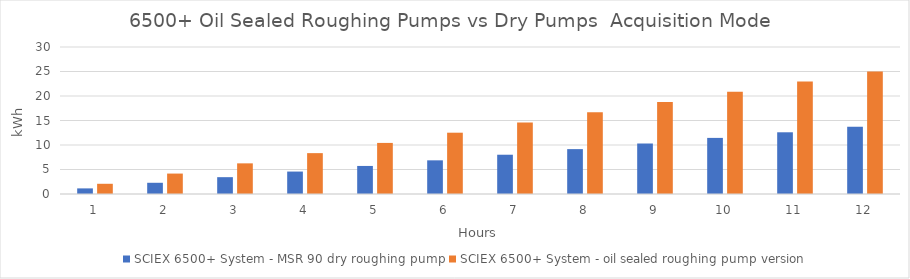
| Category | SCIEX 6500+ System - MSR 90 dry roughing pump | SCIEX 6500+ System - oil sealed roughing pump version  |
|---|---|---|
| 0 | 1.145 | 2.085 |
| 1 | 2.29 | 4.17 |
| 2 | 3.435 | 6.255 |
| 3 | 4.58 | 8.34 |
| 4 | 5.725 | 10.425 |
| 5 | 6.87 | 12.51 |
| 6 | 8.015 | 14.595 |
| 7 | 9.16 | 16.68 |
| 8 | 10.305 | 18.765 |
| 9 | 11.45 | 20.85 |
| 10 | 12.595 | 22.935 |
| 11 | 13.74 | 25.02 |